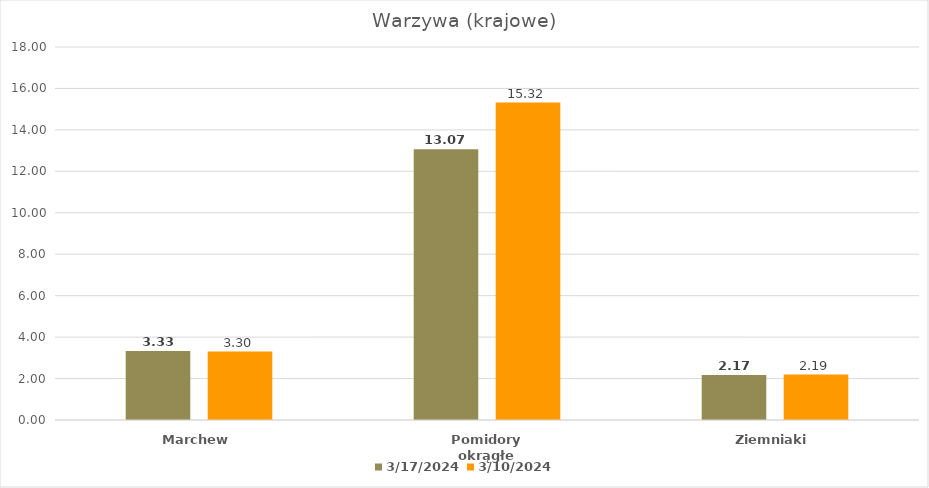
| Category | 2024-03-17 | 2024-03-10 |
|---|---|---|
| Marchew | 3.33 | 3.3 |
| Pomidory okrągłe | 13.07 | 15.32 |
| Ziemniaki | 2.17 | 2.19 |